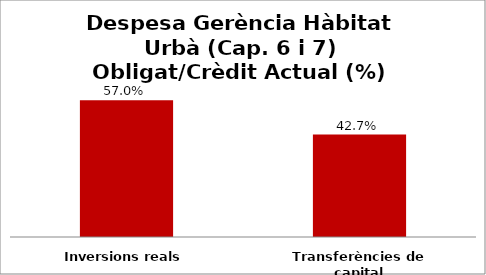
| Category | Series 0 |
|---|---|
| Inversions reals | 0.57 |
| Transferències de capital | 0.427 |